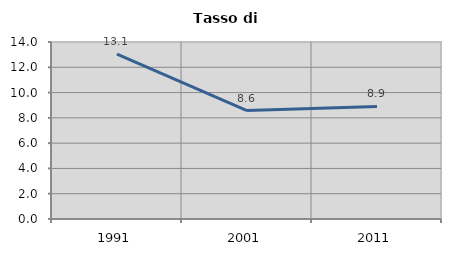
| Category | Tasso di disoccupazione   |
|---|---|
| 1991.0 | 13.05 |
| 2001.0 | 8.576 |
| 2011.0 | 8.905 |